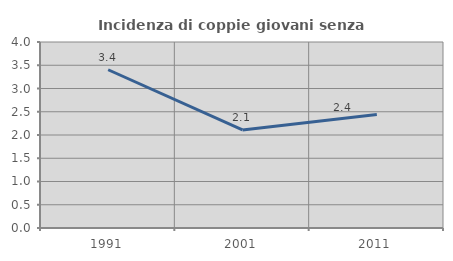
| Category | Incidenza di coppie giovani senza figli |
|---|---|
| 1991.0 | 3.403 |
| 2001.0 | 2.109 |
| 2011.0 | 2.441 |